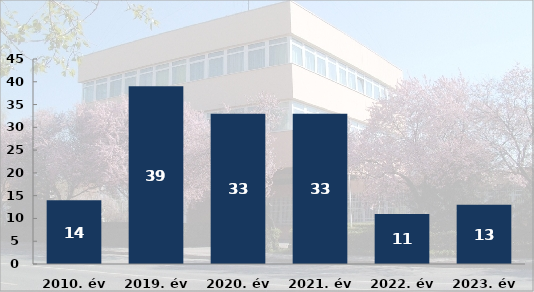
| Category | Bűncselekmény gyanúja miatti előállítások száma |
|---|---|
| 2010. év | 14 |
| 2019. év | 39 |
| 2020. év | 33 |
| 2021. év | 33 |
| 2022. év | 11 |
| 2023. év | 13 |